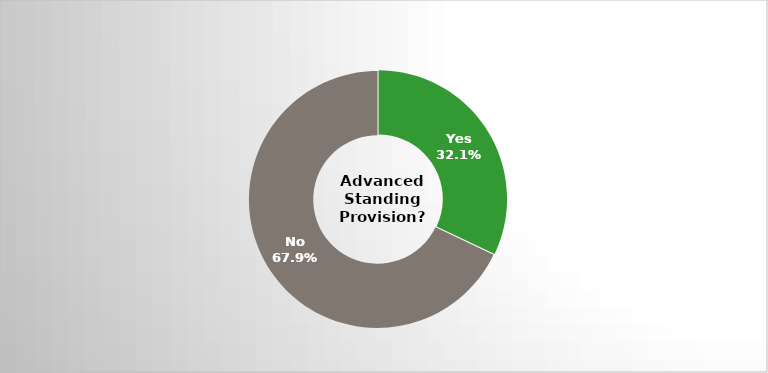
| Category | Series 0 |
|---|---|
| Yes | 0.321 |
| No | 0.679 |